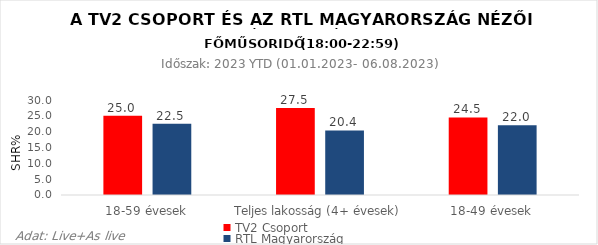
| Category | TV2 Csoport | RTL Magyarország |
|---|---|---|
| 18-59 évesek | 25 | 22.5 |
| Teljes lakosság (4+ évesek) | 27.5 | 20.4 |
| 18-49 évesek | 24.5 | 22 |